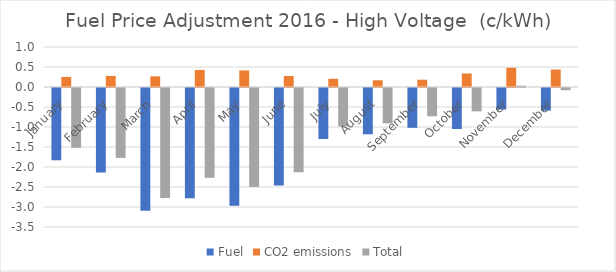
| Category | Fuel | CO2 emissions | Total |
|---|---|---|---|
| January | -1.807 | 0.252 | -1.494 |
| February | -2.111 | 0.277 | -1.747 |
| March | -3.067 | 0.266 | -2.748 |
| April | -2.759 | 0.427 | -2.246 |
| May | -2.942 | 0.414 | -2.473 |
| June | -2.435 | 0.274 | -2.106 |
| July | -1.275 | 0.205 | -0.958 |
| August | -1.158 | 0.168 | -0.884 |
| September | -0.995 | 0.182 | -0.708 |
| October | -1.025 | 0.338 | -0.584 |
| November | -0.538 | 0.482 | 0.033 |
| December | -0.565 | 0.437 | -0.055 |